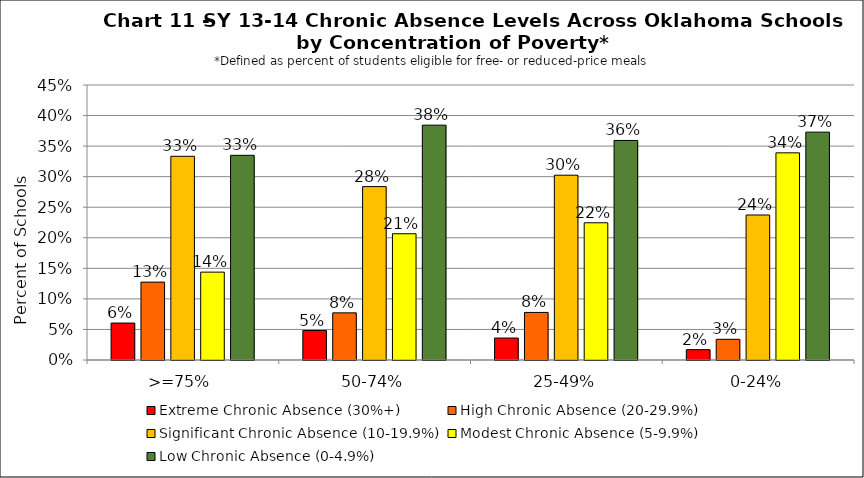
| Category | Extreme Chronic Absence (30%+) | High Chronic Absence (20-29.9%) | Significant Chronic Absence (10-19.9%) | Modest Chronic Absence (5-9.9%) | Low Chronic Absence (0-4.9%) |
|---|---|---|---|---|---|
| 0 | 0.06 | 0.127 | 0.333 | 0.144 | 0.335 |
| 1 | 0.048 | 0.077 | 0.284 | 0.207 | 0.384 |
| 2 | 0.036 | 0.078 | 0.302 | 0.225 | 0.359 |
| 3 | 0.017 | 0.034 | 0.237 | 0.339 | 0.373 |